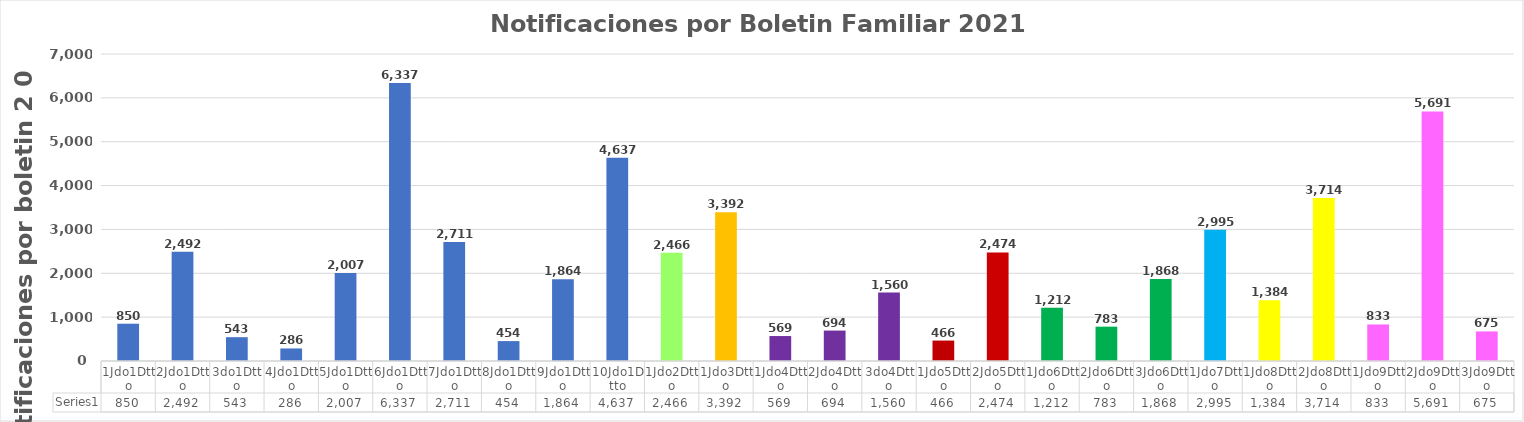
| Category | Series 0 |
|---|---|
| 1Jdo1Dtto | 850 |
| 2Jdo1Dtto | 2492 |
| 3do1Dtto | 543 |
| 4Jdo1Dtto | 286 |
| 5Jdo1Dtto | 2007 |
| 6Jdo1Dtto | 6337 |
| 7Jdo1Dtto | 2711 |
| 8Jdo1Dtto | 454 |
| 9Jdo1Dtto | 1864 |
| 10Jdo1Dtto | 4637 |
| 1Jdo2Dtto | 2466 |
| 1Jdo3Dtto | 3392 |
| 1Jdo4Dtto | 569 |
| 2Jdo4Dtto | 694 |
| 3do4Dtto | 1560 |
| 1Jdo5Dtto | 466 |
| 2Jdo5Dtto | 2474 |
| 1Jdo6Dtto | 1212 |
| 2Jdo6Dtto | 783 |
| 3Jdo6Dtto | 1868 |
| 1Jdo7Dtto | 2995 |
| 1Jdo8Dtto | 1384 |
| 2Jdo8Dtto | 3714 |
| 1Jdo9Dtto | 833 |
| 2Jdo9Dtto | 5691 |
| 3Jdo9Dtto | 675 |